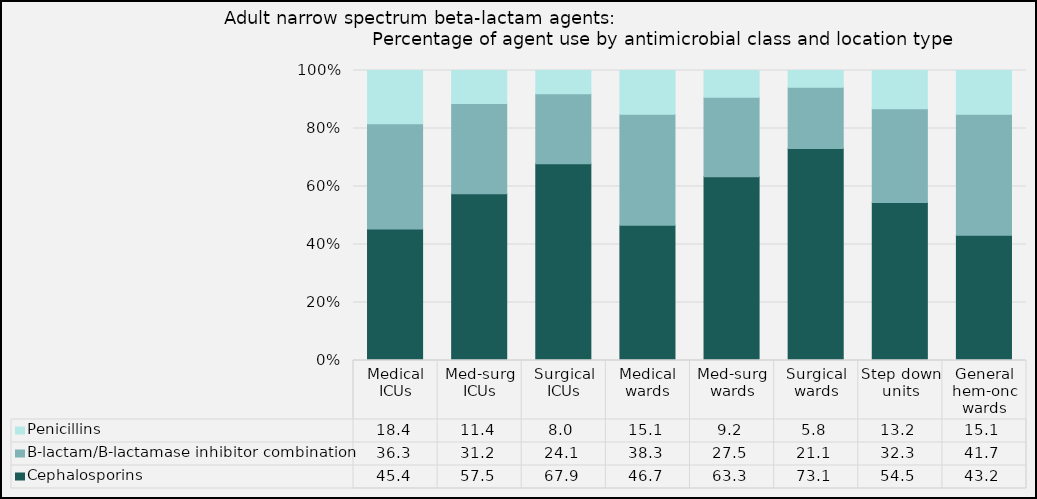
| Category | Cephalosporins | B-lactam/B-lactamase inhibitor combination | Penicillins |
|---|---|---|---|
| Medical ICUs | 45.37 | 36.27 | 18.35 |
| Med-surg ICUs | 57.47 | 31.18 | 11.35 |
| Surgical ICUs | 67.85 | 24.14 | 8.02 |
| Medical wards | 46.67 | 38.25 | 15.08 |
| Med-surg wards | 63.32 | 27.47 | 9.2 |
| Surgical wards | 73.1 | 21.1 | 5.8 |
| Step down units | 54.49 | 32.29 | 13.22 |
| General hem-onc wards | 43.21 | 41.68 | 15.11 |